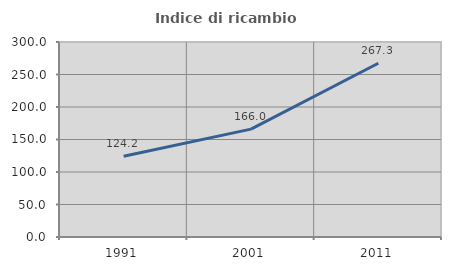
| Category | Indice di ricambio occupazionale  |
|---|---|
| 1991.0 | 124.181 |
| 2001.0 | 165.986 |
| 2011.0 | 267.273 |